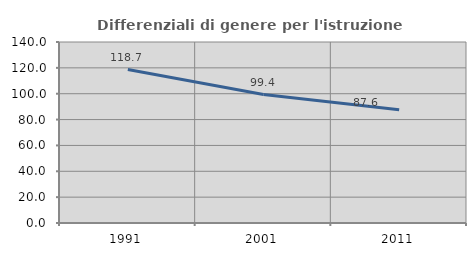
| Category | Differenziali di genere per l'istruzione superiore |
|---|---|
| 1991.0 | 118.657 |
| 2001.0 | 99.38 |
| 2011.0 | 87.613 |